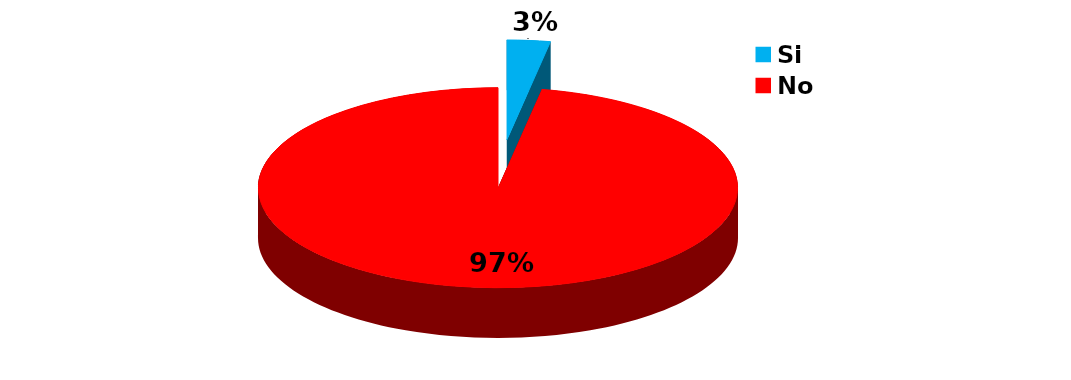
| Category | Series 0 |
|---|---|
| Si | 3 |
| No | 100 |